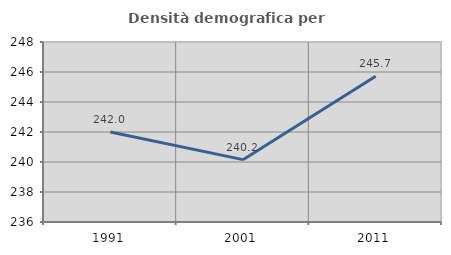
| Category | Densità demografica |
|---|---|
| 1991.0 | 242.004 |
| 2001.0 | 240.157 |
| 2011.0 | 245.718 |